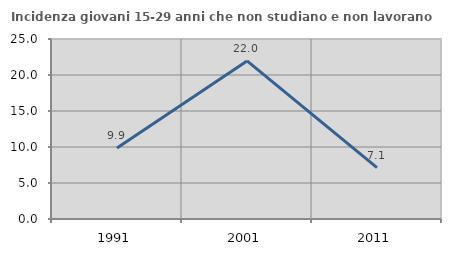
| Category | Incidenza giovani 15-29 anni che non studiano e non lavorano  |
|---|---|
| 1991.0 | 9.852 |
| 2001.0 | 21.951 |
| 2011.0 | 7.143 |